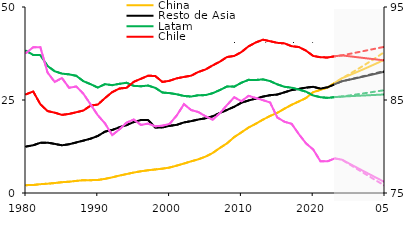
| Category | China | Resto de Asia | Latam | Chile |
|---|---|---|---|---|
| 1980 | 2.107 | 12.486 | 38.242 | 26.522 |
| 1981 | 2.151 | 12.83 | 37.116 | 27.295 |
| 1982 | 2.374 | 13.503 | 37.061 | 23.861 |
| 1983 | 2.504 | 13.541 | 34.151 | 22.024 |
| 1984 | 2.679 | 13.201 | 32.72 | 21.596 |
| 1985 | 2.903 | 12.824 | 32.098 | 21.001 |
| 1986 | 3.036 | 13.102 | 31.889 | 21.252 |
| 1987 | 3.253 | 13.591 | 31.503 | 21.71 |
| 1988 | 3.45 | 14.085 | 30.052 | 22.181 |
| 1989 | 3.448 | 14.6 | 29.251 | 23.492 |
| 1990 | 3.504 | 15.332 | 28.347 | 23.775 |
| 1991 | 3.804 | 16.494 | 29.262 | 25.51 |
| 1992 | 4.205 | 16.938 | 28.991 | 27.114 |
| 1993 | 4.674 | 17.661 | 29.345 | 28.082 |
| 1994 | 5.083 | 18.245 | 29.635 | 28.271 |
| 1995 | 5.502 | 19.073 | 28.804 | 29.882 |
| 1996 | 5.839 | 19.61 | 28.692 | 30.701 |
| 1997 | 6.114 | 19.626 | 28.881 | 31.526 |
| 1998 | 6.329 | 17.61 | 28.27 | 31.448 |
| 1999 | 6.543 | 17.644 | 27.014 | 29.854 |
| 2000 | 6.841 | 18.055 | 26.853 | 30.176 |
| 2001 | 7.366 | 18.323 | 26.539 | 30.828 |
| 2002 | 7.921 | 18.964 | 26.087 | 31.2 |
| 2003 | 8.51 | 19.325 | 25.931 | 31.539 |
| 2004 | 9.06 | 19.756 | 26.281 | 32.531 |
| 2005 | 9.777 | 20.084 | 26.319 | 33.206 |
| 2006 | 10.761 | 20.619 | 26.83 | 34.301 |
| 2007 | 12.108 | 21.512 | 27.678 | 35.308 |
| 2008 | 13.35 | 22.339 | 28.65 | 36.56 |
| 2009 | 15.034 | 23.184 | 28.589 | 36.833 |
| 2010 | 16.291 | 24.259 | 29.649 | 37.885 |
| 2011 | 17.6 | 24.869 | 30.414 | 39.429 |
| 2012 | 18.607 | 25.384 | 30.377 | 40.461 |
| 2013 | 19.727 | 25.912 | 30.548 | 41.221 |
| 2014 | 20.707 | 26.292 | 30.071 | 40.802 |
| 2015 | 21.549 | 26.465 | 29.203 | 40.367 |
| 2016 | 22.669 | 27.067 | 28.553 | 40.219 |
| 2017 | 23.715 | 27.663 | 28.301 | 39.46 |
| 2018 | 24.611 | 27.978 | 27.797 | 39.242 |
| 2019 | 25.53 | 28.327 | 27.239 | 38.265 |
| 2020 | 27.109 | 28.544 | 26.219 | 36.846 |
| 2021 | 27.714 | 28.055 | 25.76 | 36.493 |
| 2022 | 28.363 | 28.409 | 25.568 | 36.435 |
| 2023 | 29.603 | 29.249 | 25.779 | 36.755 |
| 2024 | 30.839 | 30.039 | 25.927 | 36.998 |
| 2025 | 31.63 | 30.448 | 26.02 | 36.764 |
| 2026 | 32.442 | 30.867 | 26.114 | 36.533 |
| 2027 | 33.274 | 31.296 | 26.209 | 36.302 |
| 2028 | 34.128 | 31.735 | 26.304 | 36.073 |
| 2029 | 35.004 | 32.183 | 26.4 | 35.846 |
| 2030 | 35.902 | 32.642 | 26.497 | 35.62 |